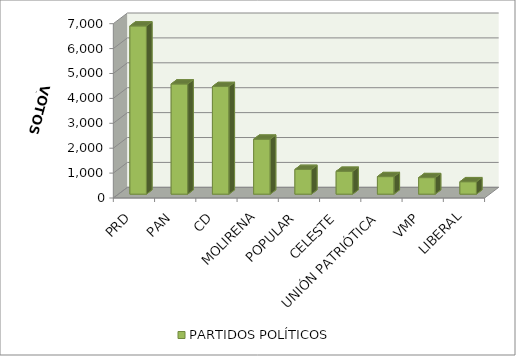
| Category | PARTIDOS POLÍTICOS |
|---|---|
| PRD | 6755 |
| PAN | 4424 |
| CD | 4321 |
| MOLIRENA | 2207 |
| POPULAR | 993 |
| CELESTE | 917 |
| UNIÓN PATRIÓTICA | 704 |
| VMP | 663 |
| LIBERAL | 499 |